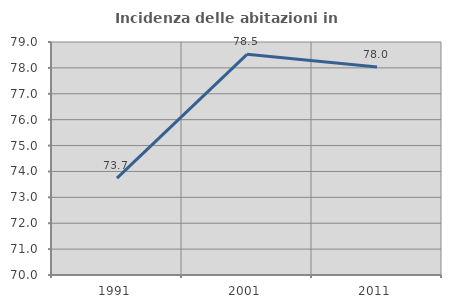
| Category | Incidenza delle abitazioni in proprietà  |
|---|---|
| 1991.0 | 73.745 |
| 2001.0 | 78.524 |
| 2011.0 | 78.031 |